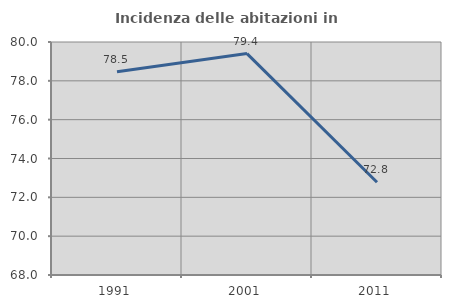
| Category | Incidenza delle abitazioni in proprietà  |
|---|---|
| 1991.0 | 78.467 |
| 2001.0 | 79.404 |
| 2011.0 | 72.776 |